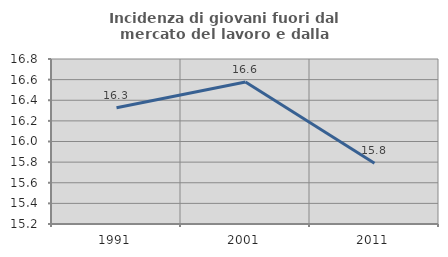
| Category | Incidenza di giovani fuori dal mercato del lavoro e dalla formazione  |
|---|---|
| 1991.0 | 16.327 |
| 2001.0 | 16.578 |
| 2011.0 | 15.789 |